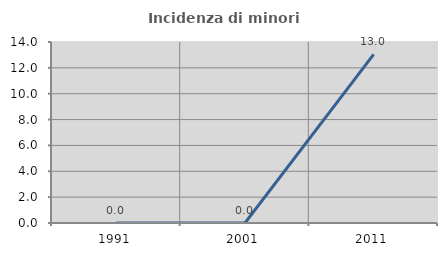
| Category | Incidenza di minori stranieri |
|---|---|
| 1991.0 | 0 |
| 2001.0 | 0 |
| 2011.0 | 13.043 |